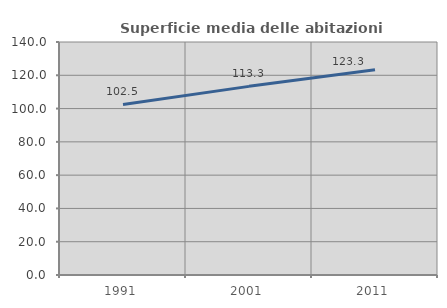
| Category | Superficie media delle abitazioni occupate |
|---|---|
| 1991.0 | 102.481 |
| 2001.0 | 113.346 |
| 2011.0 | 123.331 |